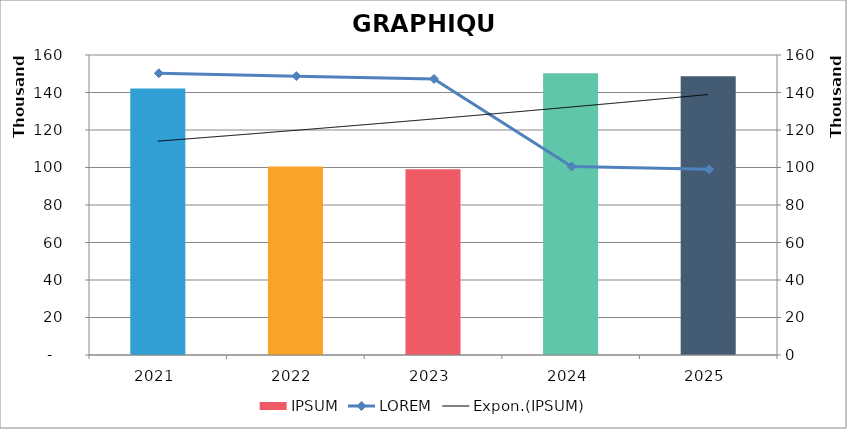
| Category | IPSUM |
|---|---|
| 2021.0 | 142088 |
| 2022.0 | 100523 |
| 2023.0 | 99003 |
| 2024.0 | 150253 |
| 2025.0 | 148733 |